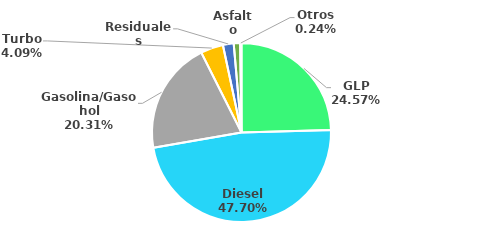
| Category | MBPD |
|---|---|
| GLP | 58.6 |
| Diesel | 113.742 |
| Gasolina/Gasohol | 48.427 |
| Turbo | 9.748 |
| Residuales | 4.635 |
| Asfalto | 2.744 |
| Otros | 0.578 |